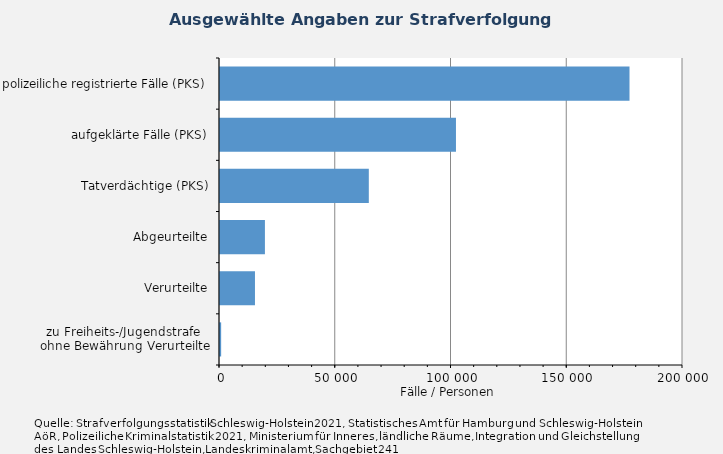
| Category | Fälle/Personen |
|---|---|
| zu Freiheits-/Jugendstrafe 
ohne Bewährung Verurteilte | 496 |
| Verurteilte | 15107 |
| Abgeurteilte | 19406 |
| Tatverdächtige (PKS) | 64283 |
| aufgeklärte Fälle (PKS) | 101930 |
| polizeiliche registrierte Fälle (PKS) | 176893 |